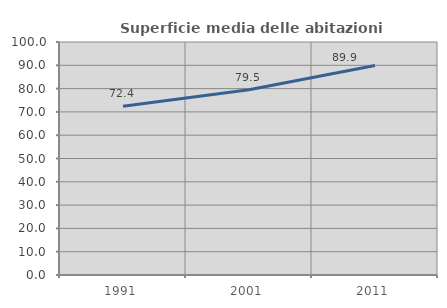
| Category | Superficie media delle abitazioni occupate |
|---|---|
| 1991.0 | 72.384 |
| 2001.0 | 79.526 |
| 2011.0 | 89.898 |